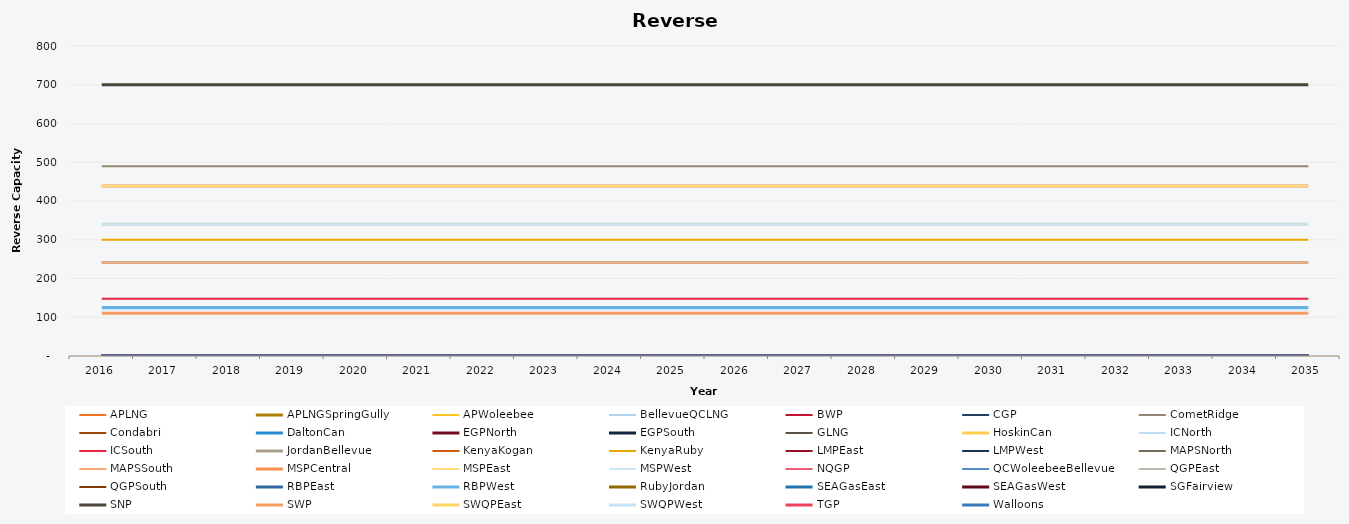
| Category | APLNG | APLNGSpringGully | APWoleebee | BellevueQCLNG | BWP | CGP | CometRidge | Condabri | DaltonCan | EGPNorth | EGPSouth | GLNG | HoskinCan | ICNorth | ICSouth | JordanBellevue | KenyaKogan | KenyaRuby | LMPEast | LMPWest | MAPSNorth | MAPSSouth | MSPCentral | MSPEast | MSPWest | NQGP | QCWoleebeeBellevue | QGPEast | QGPSouth | RBPEast | RBPWest | RubyJordan | SEAGasEast | SEAGasWest | SGFairview | SNP | SWP | SWQPEast | SWQPWest | TGP | Walloons |
|---|---|---|---|---|---|---|---|---|---|---|---|---|---|---|---|---|---|---|---|---|---|---|---|---|---|---|---|---|---|---|---|---|---|---|---|---|---|---|---|---|---|
| 2016.0 | 0 | 0 | 0 | 0 | 0 | 0 | 490 | 0 | 0 | 0 | 0 | 0 | 0 | 148 | 148 | 0 | 0 | 300 | 0 | 0 | 241 | 241 | 439 | 439 | 120 | 0 | 0 | 0 | 0 | 0 | 125 | 0 | 0 | 0 | 0 | 700 | 110.5 | 340 | 340 | 0 | 0 |
| 2017.0 | 0 | 0 | 0 | 0 | 0 | 0 | 490 | 0 | 0 | 0 | 0 | 0 | 0 | 148 | 148 | 0 | 0 | 300 | 0 | 0 | 241 | 241 | 439 | 439 | 120 | 0 | 0 | 0 | 0 | 0 | 125 | 0 | 0 | 0 | 0 | 700 | 110.5 | 340 | 340 | 0 | 0 |
| 2018.0 | 0 | 0 | 0 | 0 | 0 | 0 | 490 | 0 | 0 | 0 | 0 | 0 | 0 | 148 | 148 | 0 | 0 | 300 | 0 | 0 | 241 | 241 | 439 | 439 | 120 | 0 | 0 | 0 | 0 | 0 | 125 | 0 | 0 | 0 | 0 | 700 | 110.5 | 340 | 340 | 0 | 0 |
| 2019.0 | 0 | 0 | 0 | 0 | 0 | 0 | 490 | 0 | 0 | 0 | 0 | 0 | 0 | 148 | 148 | 0 | 0 | 300 | 0 | 0 | 241 | 241 | 439 | 439 | 120 | 0 | 0 | 0 | 0 | 0 | 125 | 0 | 0 | 0 | 0 | 700 | 110.5 | 340 | 340 | 0 | 0 |
| 2020.0 | 0 | 0 | 0 | 0 | 0 | 0 | 490 | 0 | 0 | 0 | 0 | 0 | 0 | 148 | 148 | 0 | 0 | 300 | 0 | 0 | 241 | 241 | 439 | 439 | 120 | 0 | 0 | 0 | 0 | 0 | 125 | 0 | 0 | 0 | 0 | 700 | 110.5 | 340 | 340 | 0 | 0 |
| 2021.0 | 0 | 0 | 0 | 0 | 0 | 0 | 490 | 0 | 0 | 0 | 0 | 0 | 0 | 148 | 148 | 0 | 0 | 300 | 0 | 0 | 241 | 241 | 439 | 439 | 120 | 0 | 0 | 0 | 0 | 0 | 125 | 0 | 0 | 0 | 0 | 700 | 110.5 | 340 | 340 | 0 | 0 |
| 2022.0 | 0 | 0 | 0 | 0 | 0 | 0 | 490 | 0 | 0 | 0 | 0 | 0 | 0 | 148 | 148 | 0 | 0 | 300 | 0 | 0 | 241 | 241 | 439 | 439 | 120 | 0 | 0 | 0 | 0 | 0 | 125 | 0 | 0 | 0 | 0 | 700 | 110.5 | 340 | 340 | 0 | 0 |
| 2023.0 | 0 | 0 | 0 | 0 | 0 | 0 | 490 | 0 | 0 | 0 | 0 | 0 | 0 | 148 | 148 | 0 | 0 | 300 | 0 | 0 | 241 | 241 | 439 | 439 | 120 | 0 | 0 | 0 | 0 | 0 | 125 | 0 | 0 | 0 | 0 | 700 | 110.5 | 340 | 340 | 0 | 0 |
| 2024.0 | 0 | 0 | 0 | 0 | 0 | 0 | 490 | 0 | 0 | 0 | 0 | 0 | 0 | 148 | 148 | 0 | 0 | 300 | 0 | 0 | 241 | 241 | 439 | 439 | 120 | 0 | 0 | 0 | 0 | 0 | 125 | 0 | 0 | 0 | 0 | 700 | 110.5 | 340 | 340 | 0 | 0 |
| 2025.0 | 0 | 0 | 0 | 0 | 0 | 0 | 490 | 0 | 0 | 0 | 0 | 0 | 0 | 148 | 148 | 0 | 0 | 300 | 0 | 0 | 241 | 241 | 439 | 439 | 120 | 0 | 0 | 0 | 0 | 0 | 125 | 0 | 0 | 0 | 0 | 700 | 110.5 | 340 | 340 | 0 | 0 |
| 2026.0 | 0 | 0 | 0 | 0 | 0 | 0 | 490 | 0 | 0 | 0 | 0 | 0 | 0 | 148 | 148 | 0 | 0 | 300 | 0 | 0 | 241 | 241 | 439 | 439 | 120 | 0 | 0 | 0 | 0 | 0 | 125 | 0 | 0 | 0 | 0 | 700 | 110.5 | 340 | 340 | 0 | 0 |
| 2027.0 | 0 | 0 | 0 | 0 | 0 | 0 | 490 | 0 | 0 | 0 | 0 | 0 | 0 | 148 | 148 | 0 | 0 | 300 | 0 | 0 | 241 | 241 | 439 | 439 | 120 | 0 | 0 | 0 | 0 | 0 | 125 | 0 | 0 | 0 | 0 | 700 | 110.5 | 340 | 340 | 0 | 0 |
| 2028.0 | 0 | 0 | 0 | 0 | 0 | 0 | 490 | 0 | 0 | 0 | 0 | 0 | 0 | 148 | 148 | 0 | 0 | 300 | 0 | 0 | 241 | 241 | 439 | 439 | 120 | 0 | 0 | 0 | 0 | 0 | 125 | 0 | 0 | 0 | 0 | 700 | 110.5 | 340 | 340 | 0 | 0 |
| 2029.0 | 0 | 0 | 0 | 0 | 0 | 0 | 490 | 0 | 0 | 0 | 0 | 0 | 0 | 148 | 148 | 0 | 0 | 300 | 0 | 0 | 241 | 241 | 439 | 439 | 120 | 0 | 0 | 0 | 0 | 0 | 125 | 0 | 0 | 0 | 0 | 700 | 110.5 | 340 | 340 | 0 | 0 |
| 2030.0 | 0 | 0 | 0 | 0 | 0 | 0 | 490 | 0 | 0 | 0 | 0 | 0 | 0 | 148 | 148 | 0 | 0 | 300 | 0 | 0 | 241 | 241 | 439 | 439 | 120 | 0 | 0 | 0 | 0 | 0 | 125 | 0 | 0 | 0 | 0 | 700 | 110.5 | 340 | 340 | 0 | 0 |
| 2031.0 | 0 | 0 | 0 | 0 | 0 | 0 | 490 | 0 | 0 | 0 | 0 | 0 | 0 | 148 | 148 | 0 | 0 | 300 | 0 | 0 | 241 | 241 | 439 | 439 | 120 | 0 | 0 | 0 | 0 | 0 | 125 | 0 | 0 | 0 | 0 | 700 | 110.5 | 340 | 340 | 0 | 0 |
| 2032.0 | 0 | 0 | 0 | 0 | 0 | 0 | 490 | 0 | 0 | 0 | 0 | 0 | 0 | 148 | 148 | 0 | 0 | 300 | 0 | 0 | 241 | 241 | 439 | 439 | 120 | 0 | 0 | 0 | 0 | 0 | 125 | 0 | 0 | 0 | 0 | 700 | 110.5 | 340 | 340 | 0 | 0 |
| 2033.0 | 0 | 0 | 0 | 0 | 0 | 0 | 490 | 0 | 0 | 0 | 0 | 0 | 0 | 148 | 148 | 0 | 0 | 300 | 0 | 0 | 241 | 241 | 439 | 439 | 120 | 0 | 0 | 0 | 0 | 0 | 125 | 0 | 0 | 0 | 0 | 700 | 110.5 | 340 | 340 | 0 | 0 |
| 2034.0 | 0 | 0 | 0 | 0 | 0 | 0 | 490 | 0 | 0 | 0 | 0 | 0 | 0 | 148 | 148 | 0 | 0 | 300 | 0 | 0 | 241 | 241 | 439 | 439 | 120 | 0 | 0 | 0 | 0 | 0 | 125 | 0 | 0 | 0 | 0 | 700 | 110.5 | 340 | 340 | 0 | 0 |
| 2035.0 | 0 | 0 | 0 | 0 | 0 | 0 | 490 | 0 | 0 | 0 | 0 | 0 | 0 | 148 | 148 | 0 | 0 | 300 | 0 | 0 | 241 | 241 | 439 | 439 | 120 | 0 | 0 | 0 | 0 | 0 | 125 | 0 | 0 | 0 | 0 | 700 | 110.5 | 340 | 340 | 0 | 0 |